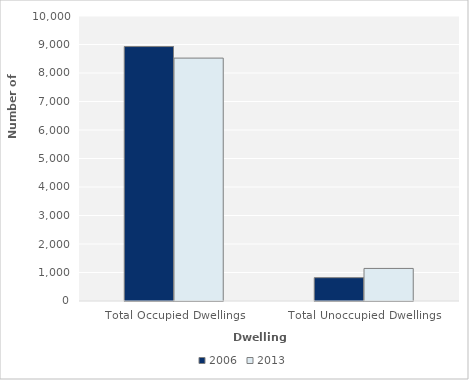
| Category | 2006 | 2013 |
|---|---|---|
| Total Occupied Dwellings | 8928 | 8523 |
| Total Unoccupied Dwellings | 819 | 1143 |